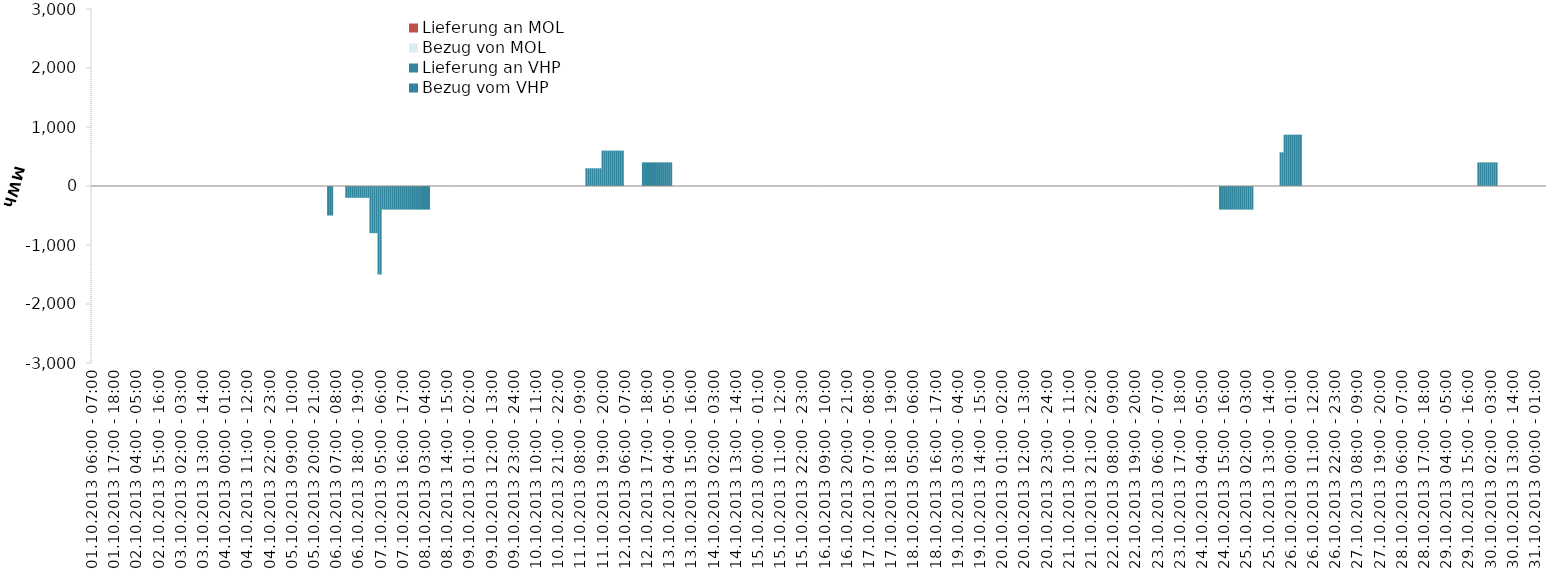
| Category | Bezug vom VHP | Lieferung an VHP | Bezug von MOL | Lieferung an MOL |
|---|---|---|---|---|
| 01.10.2013 06:00 - 07:00 | 0 | 0 | 0 | 0 |
| 01.10.2013 07:00 - 08:00 | 0 | 0 | 0 | 0 |
| 01.10.2013 08:00 - 09:00 | 0 | 0 | 0 | 0 |
| 01.10.2013 09:00 - 10:00 | 0 | 0 | 0 | 0 |
| 01.10.2013 10:00 - 11:00 | 0 | 0 | 0 | 0 |
| 01.10.2013 11:00 - 12:00 | 0 | 0 | 0 | 0 |
| 01.10.2013 12:00 - 13:00 | 0 | 0 | 0 | 0 |
| 01.10.2013 13:00 - 14:00 | 0 | 0 | 0 | 0 |
| 01.10.2013 14:00 - 15:00 | 0 | 0 | 0 | 0 |
| 01.10.2013 15:00 - 16:00 | 0 | 0 | 0 | 0 |
| 01.10.2013 16:00 - 17:00 | 0 | 0 | 0 | 0 |
| 01.10.2013 17:00 - 18:00 | 0 | 0 | 0 | 0 |
| 01.10.2013 18:00 - 19:00 | 0 | 0 | 0 | 0 |
| 01.10.2013 19:00 - 20:00 | 0 | 0 | 0 | 0 |
| 01.10.2013 20:00 - 21:00 | 0 | 0 | 0 | 0 |
| 01.10.2013 21:00 - 22:00 | 0 | 0 | 0 | 0 |
| 01.10.2013 22:00 - 23:00 | 0 | 0 | 0 | 0 |
| 01.10.2013 23:00 - 24:00 | 0 | 0 | 0 | 0 |
| 02.10.2013 00:00 - 01:00 | 0 | 0 | 0 | 0 |
| 02.10.2013 01:00 - 02:00 | 0 | 0 | 0 | 0 |
| 02.10.2013 02:00 - 03:00 | 0 | 0 | 0 | 0 |
| 02.10.2013 03:00 - 04:00 | 0 | 0 | 0 | 0 |
| 02.10.2013 04:00 - 05:00 | 0 | 0 | 0 | 0 |
| 02.10.2013 05:00 - 06:00 | 0 | 0 | 0 | 0 |
| 02.10.2013 06:00 - 07:00 | 0 | 0 | 0 | 0 |
| 02.10.2013 07:00 - 08:00 | 0 | 0 | 0 | 0 |
| 02.10.2013 08:00 - 09:00 | 0 | 0 | 0 | 0 |
| 02.10.2013 09:00 - 10:00 | 0 | 0 | 0 | 0 |
| 02.10.2013 10:00 - 11:00 | 0 | 0 | 0 | 0 |
| 02.10.2013 11:00 - 12:00 | 0 | 0 | 0 | 0 |
| 02.10.2013 12:00 - 13:00 | 0 | 0 | 0 | 0 |
| 02.10.2013 13:00 - 14:00 | 0 | 0 | 0 | 0 |
| 02.10.2013 14:00 - 15:00 | 0 | 0 | 0 | 0 |
| 02.10.2013 15:00 - 16:00 | 0 | 0 | 0 | 0 |
| 02.10.2013 16:00 - 17:00 | 0 | 0 | 0 | 0 |
| 02.10.2013 17:00 - 18:00 | 0 | 0 | 0 | 0 |
| 02.10.2013 18:00 - 19:00 | 0 | 0 | 0 | 0 |
| 02.10.2013 19:00 - 20:00 | 0 | 0 | 0 | 0 |
| 02.10.2013 20:00 - 21:00 | 0 | 0 | 0 | 0 |
| 02.10.2013 21:00 - 22:00 | 0 | 0 | 0 | 0 |
| 02.10.2013 22:00 - 23:00 | 0 | 0 | 0 | 0 |
| 02.10.2013 23:00 - 24:00 | 0 | 0 | 0 | 0 |
| 03.10.2013 00:00 - 01:00 | 0 | 0 | 0 | 0 |
| 03.10.2013 01:00 - 02:00 | 0 | 0 | 0 | 0 |
| 03.10.2013 02:00 - 03:00 | 0 | 0 | 0 | 0 |
| 03.10.2013 03:00 - 04:00 | 0 | 0 | 0 | 0 |
| 03.10.2013 04:00 - 05:00 | 0 | 0 | 0 | 0 |
| 03.10.2013 05:00 - 06:00 | 0 | 0 | 0 | 0 |
| 03.10.2013 06:00 - 07:00 | 0 | 0 | 0 | 0 |
| 03.10.2013 07:00 - 08:00 | 0 | 0 | 0 | 0 |
| 03.10.2013 08:00 - 09:00 | 0 | 0 | 0 | 0 |
| 03.10.2013 09:00 - 10:00 | 0 | 0 | 0 | 0 |
| 03.10.2013 10:00 - 11:00 | 0 | 0 | 0 | 0 |
| 03.10.2013 11:00 - 12:00 | 0 | 0 | 0 | 0 |
| 03.10.2013 12:00 - 13:00 | 0 | 0 | 0 | 0 |
| 03.10.2013 13:00 - 14:00 | 0 | 0 | 0 | 0 |
| 03.10.2013 14:00 - 15:00 | 0 | 0 | 0 | 0 |
| 03.10.2013 15:00 - 16:00 | 0 | 0 | 0 | 0 |
| 03.10.2013 16:00 - 17:00 | 0 | 0 | 0 | 0 |
| 03.10.2013 17:00 - 18:00 | 0 | 0 | 0 | 0 |
| 03.10.2013 18:00 - 19:00 | 0 | 0 | 0 | 0 |
| 03.10.2013 19:00 - 20:00 | 0 | 0 | 0 | 0 |
| 03.10.2013 20:00 - 21:00 | 0 | 0 | 0 | 0 |
| 03.10.2013 21:00 - 22:00 | 0 | 0 | 0 | 0 |
| 03.10.2013 22:00 - 23:00 | 0 | 0 | 0 | 0 |
| 03.10.2013 23:00 - 24:00 | 0 | 0 | 0 | 0 |
| 04.10.2013 00:00 - 01:00 | 0 | 0 | 0 | 0 |
| 04.10.2013 01:00 - 02:00 | 0 | 0 | 0 | 0 |
| 04.10.2013 02:00 - 03:00 | 0 | 0 | 0 | 0 |
| 04.10.2013 03:00 - 04:00 | 0 | 0 | 0 | 0 |
| 04.10.2013 04:00 - 05:00 | 0 | 0 | 0 | 0 |
| 04.10.2013 05:00 - 06:00 | 0 | 0 | 0 | 0 |
| 04.10.2013 06:00 - 07:00 | 0 | 0 | 0 | 0 |
| 04.10.2013 07:00 - 08:00 | 0 | 0 | 0 | 0 |
| 04.10.2013 08:00 - 09:00 | 0 | 0 | 0 | 0 |
| 04.10.2013 09:00 - 10:00 | 0 | 0 | 0 | 0 |
| 04.10.2013 10:00 - 11:00 | 0 | 0 | 0 | 0 |
| 04.10.2013 11:00 - 12:00 | 0 | 0 | 0 | 0 |
| 04.10.2013 12:00 - 13:00 | 0 | 0 | 0 | 0 |
| 04.10.2013 13:00 - 14:00 | 0 | 0 | 0 | 0 |
| 04.10.2013 14:00 - 15:00 | 0 | 0 | 0 | 0 |
| 04.10.2013 15:00 - 16:00 | 0 | 0 | 0 | 0 |
| 04.10.2013 16:00 - 17:00 | 0 | 0 | 0 | 0 |
| 04.10.2013 17:00 - 18:00 | 0 | 0 | 0 | 0 |
| 04.10.2013 18:00 - 19:00 | 0 | 0 | 0 | 0 |
| 04.10.2013 19:00 - 20:00 | 0 | 0 | 0 | 0 |
| 04.10.2013 20:00 - 21:00 | 0 | 0 | 0 | 0 |
| 04.10.2013 21:00 - 22:00 | 0 | 0 | 0 | 0 |
| 04.10.2013 22:00 - 23:00 | 0 | 0 | 0 | 0 |
| 04.10.2013 23:00 - 24:00 | 0 | 0 | 0 | 0 |
| 05.10.2013 00:00 - 01:00 | 0 | 0 | 0 | 0 |
| 05.10.2013 01:00 - 02:00 | 0 | 0 | 0 | 0 |
| 05.10.2013 02:00 - 03:00 | 0 | 0 | 0 | 0 |
| 05.10.2013 03:00 - 04:00 | 0 | 0 | 0 | 0 |
| 05.10.2013 04:00 - 05:00 | 0 | 0 | 0 | 0 |
| 05.10.2013 05:00 - 06:00 | 0 | 0 | 0 | 0 |
| 05.10.2013 06:00 - 07:00 | 0 | 0 | 0 | 0 |
| 05.10.2013 07:00 - 08:00 | 0 | 0 | 0 | 0 |
| 05.10.2013 08:00 - 09:00 | 0 | 0 | 0 | 0 |
| 05.10.2013 09:00 - 10:00 | 0 | 0 | 0 | 0 |
| 05.10.2013 10:00 - 11:00 | 0 | 0 | 0 | 0 |
| 05.10.2013 11:00 - 12:00 | 0 | 0 | 0 | 0 |
| 05.10.2013 12:00 - 13:00 | 0 | 0 | 0 | 0 |
| 05.10.2013 13:00 - 14:00 | 0 | 0 | 0 | 0 |
| 05.10.2013 14:00 - 15:00 | 0 | 0 | 0 | 0 |
| 05.10.2013 15:00 - 16:00 | 0 | 0 | 0 | 0 |
| 05.10.2013 16:00 - 17:00 | 0 | 0 | 0 | 0 |
| 05.10.2013 17:00 - 18:00 | 0 | 0 | 0 | 0 |
| 05.10.2013 18:00 - 19:00 | 0 | 0 | 0 | 0 |
| 05.10.2013 19:00 - 20:00 | 0 | 0 | 0 | 0 |
| 05.10.2013 20:00 - 21:00 | 0 | 0 | 0 | 0 |
| 05.10.2013 21:00 - 22:00 | 0 | 0 | 0 | 0 |
| 05.10.2013 22:00 - 23:00 | 0 | 0 | 0 | 0 |
| 05.10.2013 23:00 - 24:00 | 0 | 0 | 0 | 0 |
| 06.10.2013 00:00 - 01:00 | 0 | 0 | 0 | 0 |
| 06.10.2013 01:00 - 02:00 | 0 | 0 | 0 | 0 |
| 06.10.2013 02:00 - 03:00 | 0 | 0 | 0 | 0 |
| 06.10.2013 03:00 - 04:00 | 0 | -500 | 0 | 0 |
| 06.10.2013 04:00 - 05:00 | 0 | -500 | 0 | 0 |
| 06.10.2013 05:00 - 06:00 | 0 | -500 | 0 | 0 |
| 06.10.2013 06:00 - 07:00 | 0 | 0 | 0 | 0 |
| 06.10.2013 07:00 - 08:00 | 0 | 0 | 0 | 0 |
| 06.10.2013 08:00 - 09:00 | 0 | 0 | 0 | 0 |
| 06.10.2013 09:00 - 10:00 | 0 | 0 | 0 | 0 |
| 06.10.2013 10:00 - 11:00 | 0 | 0 | 0 | 0 |
| 06.10.2013 11:00 - 12:00 | 0 | 0 | 0 | 0 |
| 06.10.2013 12:00 - 13:00 | 0 | -200 | 0 | 0 |
| 06.10.2013 13:00 - 14:00 | 0 | -200 | 0 | 0 |
| 06.10.2013 14:00 - 15:00 | 0 | -200 | 0 | 0 |
| 06.10.2013 15:00 - 16:00 | 0 | -200 | 0 | 0 |
| 06.10.2013 16:00 - 17:00 | 0 | -200 | 0 | 0 |
| 06.10.2013 17:00 - 18:00 | 0 | -200 | 0 | 0 |
| 06.10.2013 18:00 - 19:00 | 0 | -200 | 0 | 0 |
| 06.10.2013 19:00 - 20:00 | 0 | -200 | 0 | 0 |
| 06.10.2013 20:00 - 21:00 | 0 | -200 | 0 | 0 |
| 06.10.2013 21:00 - 22:00 | 0 | -200 | 0 | 0 |
| 06.10.2013 22:00 - 23:00 | 0 | -200 | 0 | 0 |
| 06.10.2013 23:00 - 24:00 | 0 | -200 | 0 | 0 |
| 07.10.2013 00:00 - 01:00 | 0 | -800 | 0 | 0 |
| 07.10.2013 01:00 - 02:00 | 0 | -800 | 0 | 0 |
| 07.10.2013 02:00 - 03:00 | 0 | -800 | 0 | 0 |
| 07.10.2013 03:00 - 04:00 | 0 | -800 | 0 | 0 |
| 07.10.2013 04:00 - 05:00 | 0 | -1500 | 0 | 0 |
| 07.10.2013 05:00 - 06:00 | 0 | -1500 | 0 | 0 |
| 07.10.2013 06:00 - 07:00 | 0 | -400 | 0 | 0 |
| 07.10.2013 07:00 - 08:00 | 0 | -400 | 0 | 0 |
| 07.10.2013 08:00 - 09:00 | 0 | -400 | 0 | 0 |
| 07.10.2013 09:00 - 10:00 | 0 | -400 | 0 | 0 |
| 07.10.2013 10:00 - 11:00 | 0 | -400 | 0 | 0 |
| 07.10.2013 11:00 - 12:00 | 0 | -400 | 0 | 0 |
| 07.10.2013 12:00 - 13:00 | 0 | -400 | 0 | 0 |
| 07.10.2013 13:00 - 14:00 | 0 | -400 | 0 | 0 |
| 07.10.2013 14:00 - 15:00 | 0 | -400 | 0 | 0 |
| 07.10.2013 15:00 - 16:00 | 0 | -400 | 0 | 0 |
| 07.10.2013 16:00 - 17:00 | 0 | -400 | 0 | 0 |
| 07.10.2013 17:00 - 18:00 | 0 | -400 | 0 | 0 |
| 07.10.2013 18:00 - 19:00 | 0 | -400 | 0 | 0 |
| 07.10.2013 19:00 - 20:00 | 0 | -400 | 0 | 0 |
| 07.10.2013 20:00 - 21:00 | 0 | -400 | 0 | 0 |
| 07.10.2013 21:00 - 22:00 | 0 | -400 | 0 | 0 |
| 07.10.2013 22:00 - 23:00 | 0 | -400 | 0 | 0 |
| 07.10.2013 23:00 - 24:00 | 0 | -400 | 0 | 0 |
| 08.10.2013 00:00 - 01:00 | 0 | -400 | 0 | 0 |
| 08.10.2013 01:00 - 02:00 | 0 | -400 | 0 | 0 |
| 08.10.2013 02:00 - 03:00 | 0 | -400 | 0 | 0 |
| 08.10.2013 03:00 - 04:00 | 0 | -400 | 0 | 0 |
| 08.10.2013 04:00 - 05:00 | 0 | -400 | 0 | 0 |
| 08.10.2013 05:00 - 06:00 | 0 | -400 | 0 | 0 |
| 08.10.2013 06:00 - 07:00 | 0 | 0 | 0 | 0 |
| 08.10.2013 07:00 - 08:00 | 0 | 0 | 0 | 0 |
| 08.10.2013 08:00 - 09:00 | 0 | 0 | 0 | 0 |
| 08.10.2013 09:00 - 10:00 | 0 | 0 | 0 | 0 |
| 08.10.2013 10:00 - 11:00 | 0 | 0 | 0 | 0 |
| 08.10.2013 11:00 - 12:00 | 0 | 0 | 0 | 0 |
| 08.10.2013 12:00 - 13:00 | 0 | 0 | 0 | 0 |
| 08.10.2013 13:00 - 14:00 | 0 | 0 | 0 | 0 |
| 08.10.2013 14:00 - 15:00 | 0 | 0 | 0 | 0 |
| 08.10.2013 15:00 - 16:00 | 0 | 0 | 0 | 0 |
| 08.10.2013 16:00 - 17:00 | 0 | 0 | 0 | 0 |
| 08.10.2013 17:00 - 18:00 | 0 | 0 | 0 | 0 |
| 08.10.2013 18:00 - 19:00 | 0 | 0 | 0 | 0 |
| 08.10.2013 19:00 - 20:00 | 0 | 0 | 0 | 0 |
| 08.10.2013 20:00 - 21:00 | 0 | 0 | 0 | 0 |
| 08.10.2013 21:00 - 22:00 | 0 | 0 | 0 | 0 |
| 08.10.2013 22:00 - 23:00 | 0 | 0 | 0 | 0 |
| 08.10.2013 23:00 - 24:00 | 0 | 0 | 0 | 0 |
| 09.10.2013 00:00 - 01:00 | 0 | 0 | 0 | 0 |
| 09.10.2013 01:00 - 02:00 | 0 | 0 | 0 | 0 |
| 09.10.2013 02:00 - 03:00 | 0 | 0 | 0 | 0 |
| 09.10.2013 03:00 - 04:00 | 0 | 0 | 0 | 0 |
| 09.10.2013 04:00 - 05:00 | 0 | 0 | 0 | 0 |
| 09.10.2013 05:00 - 06:00 | 0 | 0 | 0 | 0 |
| 09.10.2013 06:00 - 07:00 | 0 | 0 | 0 | 0 |
| 09.10.2013 07:00 - 08:00 | 0 | 0 | 0 | 0 |
| 09.10.2013 08:00 - 09:00 | 0 | 0 | 0 | 0 |
| 09.10.2013 09:00 - 10:00 | 0 | 0 | 0 | 0 |
| 09.10.2013 10:00 - 11:00 | 0 | 0 | 0 | 0 |
| 09.10.2013 11:00 - 12:00 | 0 | 0 | 0 | 0 |
| 09.10.2013 12:00 - 13:00 | 0 | 0 | 0 | 0 |
| 09.10.2013 13:00 - 14:00 | 0 | 0 | 0 | 0 |
| 09.10.2013 14:00 - 15:00 | 0 | 0 | 0 | 0 |
| 09.10.2013 15:00 - 16:00 | 0 | 0 | 0 | 0 |
| 09.10.2013 16:00 - 17:00 | 0 | 0 | 0 | 0 |
| 09.10.2013 17:00 - 18:00 | 0 | 0 | 0 | 0 |
| 09.10.2013 18:00 - 19:00 | 0 | 0 | 0 | 0 |
| 09.10.2013 19:00 - 20:00 | 0 | 0 | 0 | 0 |
| 09.10.2013 20:00 - 21:00 | 0 | 0 | 0 | 0 |
| 09.10.2013 21:00 - 22:00 | 0 | 0 | 0 | 0 |
| 09.10.2013 22:00 - 23:00 | 0 | 0 | 0 | 0 |
| 09.10.2013 23:00 - 24:00 | 0 | 0 | 0 | 0 |
| 10.10.2013 00:00 - 01:00 | 0 | 0 | 0 | 0 |
| 10.10.2013 01:00 - 02:00 | 0 | 0 | 0 | 0 |
| 10.10.2013 02:00 - 03:00 | 0 | 0 | 0 | 0 |
| 10.10.2013 03:00 - 04:00 | 0 | 0 | 0 | 0 |
| 10.10.2013 04:00 - 05:00 | 0 | 0 | 0 | 0 |
| 10.10.2013 05:00 - 06:00 | 0 | 0 | 0 | 0 |
| 10.10.2013 06:00 - 07:00 | 0 | 0 | 0 | 0 |
| 10.10.2013 07:00 - 08:00 | 0 | 0 | 0 | 0 |
| 10.10.2013 08:00 - 09:00 | 0 | 0 | 0 | 0 |
| 10.10.2013 09:00 - 10:00 | 0 | 0 | 0 | 0 |
| 10.10.2013 10:00 - 11:00 | 0 | 0 | 0 | 0 |
| 10.10.2013 11:00 - 12:00 | 0 | 0 | 0 | 0 |
| 10.10.2013 12:00 - 13:00 | 0 | 0 | 0 | 0 |
| 10.10.2013 13:00 - 14:00 | 0 | 0 | 0 | 0 |
| 10.10.2013 14:00 - 15:00 | 0 | 0 | 0 | 0 |
| 10.10.2013 15:00 - 16:00 | 0 | 0 | 0 | 0 |
| 10.10.2013 16:00 - 17:00 | 0 | 0 | 0 | 0 |
| 10.10.2013 17:00 - 18:00 | 0 | 0 | 0 | 0 |
| 10.10.2013 18:00 - 19:00 | 0 | 0 | 0 | 0 |
| 10.10.2013 19:00 - 20:00 | 0 | 0 | 0 | 0 |
| 10.10.2013 20:00 - 21:00 | 0 | 0 | 0 | 0 |
| 10.10.2013 21:00 - 22:00 | 0 | 0 | 0 | 0 |
| 10.10.2013 22:00 - 23:00 | 0 | 0 | 0 | 0 |
| 10.10.2013 23:00 - 24:00 | 0 | 0 | 0 | 0 |
| 11.10.2013 00:00 - 01:00 | 0 | 0 | 0 | 0 |
| 11.10.2013 01:00 - 02:00 | 0 | 0 | 0 | 0 |
| 11.10.2013 02:00 - 03:00 | 0 | 0 | 0 | 0 |
| 11.10.2013 03:00 - 04:00 | 0 | 0 | 0 | 0 |
| 11.10.2013 04:00 - 05:00 | 0 | 0 | 0 | 0 |
| 11.10.2013 05:00 - 06:00 | 0 | 0 | 0 | 0 |
| 11.10.2013 06:00 - 07:00 | 0 | 0 | 0 | 0 |
| 11.10.2013 07:00 - 08:00 | 0 | 0 | 0 | 0 |
| 11.10.2013 08:00 - 09:00 | 0 | 0 | 0 | 0 |
| 11.10.2013 09:00 - 10:00 | 0 | 0 | 0 | 0 |
| 11.10.2013 10:00 - 11:00 | 0 | 0 | 0 | 0 |
| 11.10.2013 11:00 - 12:00 | 300 | 0 | 0 | 0 |
| 11.10.2013 12:00 - 13:00 | 300 | 0 | 0 | 0 |
| 11.10.2013 13:00 - 14:00 | 300 | 0 | 0 | 0 |
| 11.10.2013 14:00 - 15:00 | 300 | 0 | 0 | 0 |
| 11.10.2013 15:00 - 16:00 | 300 | 0 | 0 | 0 |
| 11.10.2013 16:00 - 17:00 | 300 | 0 | 0 | 0 |
| 11.10.2013 17:00 - 18:00 | 300 | 0 | 0 | 0 |
| 11.10.2013 18:00 - 19:00 | 300 | 0 | 0 | 0 |
| 11.10.2013 19:00 - 20:00 | 600 | 0 | 0 | 0 |
| 11.10.2013 20:00 - 21:00 | 600 | 0 | 0 | 0 |
| 11.10.2013 21:00 - 22:00 | 600 | 0 | 0 | 0 |
| 11.10.2013 22:00 - 23:00 | 600 | 0 | 0 | 0 |
| 11.10.2013 23:00 - 24:00 | 600 | 0 | 0 | 0 |
| 12.10.2013 00:00 - 01:00 | 600 | 0 | 0 | 0 |
| 12.10.2013 01:00 - 02:00 | 600 | 0 | 0 | 0 |
| 12.10.2013 02:00 - 03:00 | 600 | 0 | 0 | 0 |
| 12.10.2013 03:00 - 04:00 | 600 | 0 | 0 | 0 |
| 12.10.2013 04:00 - 05:00 | 600 | 0 | 0 | 0 |
| 12.10.2013 05:00 - 06:00 | 600 | 0 | 0 | 0 |
| 12.10.2013 06:00 - 07:00 | 0 | 0 | 0 | 0 |
| 12.10.2013 07:00 - 08:00 | 0 | 0 | 0 | 0 |
| 12.10.2013 08:00 - 09:00 | 0 | 0 | 0 | 0 |
| 12.10.2013 09:00 - 10:00 | 0 | 0 | 0 | 0 |
| 12.10.2013 10:00 - 11:00 | 0 | 0 | 0 | 0 |
| 12.10.2013 11:00 - 12:00 | 0 | 0 | 0 | 0 |
| 12.10.2013 12:00 - 13:00 | 0 | 0 | 0 | 0 |
| 12.10.2013 13:00 - 14:00 | 0 | 0 | 0 | 0 |
| 12.10.2013 14:00 - 15:00 | 0 | 0 | 0 | 0 |
| 12.10.2013 15:00 - 16:00 | 400 | 0 | 0 | 0 |
| 12.10.2013 16:00 - 17:00 | 400 | 0 | 0 | 0 |
| 12.10.2013 17:00 - 18:00 | 400 | 0 | 0 | 0 |
| 12.10.2013 18:00 - 19:00 | 400 | 0 | 0 | 0 |
| 12.10.2013 19:00 - 20:00 | 400 | 0 | 0 | 0 |
| 12.10.2013 20:00 - 21:00 | 400 | 0 | 0 | 0 |
| 12.10.2013 21:00 - 22:00 | 400 | 0 | 0 | 0 |
| 12.10.2013 22:00 - 23:00 | 400 | 0 | 0 | 0 |
| 12.10.2013 23:00 - 24:00 | 400 | 0 | 0 | 0 |
| 13.10.2013 00:00 - 01:00 | 400 | 0 | 0 | 0 |
| 13.10.2013 01:00 - 02:00 | 400 | 0 | 0 | 0 |
| 13.10.2013 02:00 - 03:00 | 400 | 0 | 0 | 0 |
| 13.10.2013 03:00 - 04:00 | 400 | 0 | 0 | 0 |
| 13.10.2013 04:00 - 05:00 | 400 | 0 | 0 | 0 |
| 13.10.2013 05:00 - 06:00 | 400 | 0 | 0 | 0 |
| 13.10.2013 06:00 - 07:00 | 0 | 0 | 0 | 0 |
| 13.10.2013 07:00 - 08:00 | 0 | 0 | 0 | 0 |
| 13.10.2013 08:00 - 09:00 | 0 | 0 | 0 | 0 |
| 13.10.2013 09:00 - 10:00 | 0 | 0 | 0 | 0 |
| 13.10.2013 10:00 - 11:00 | 0 | 0 | 0 | 0 |
| 13.10.2013 11:00 - 12:00 | 0 | 0 | 0 | 0 |
| 13.10.2013 12:00 - 13:00 | 0 | 0 | 0 | 0 |
| 13.10.2013 13:00 - 14:00 | 0 | 0 | 0 | 0 |
| 13.10.2013 14:00 - 15:00 | 0 | 0 | 0 | 0 |
| 13.10.2013 15:00 - 16:00 | 0 | 0 | 0 | 0 |
| 13.10.2013 16:00 - 17:00 | 0 | 0 | 0 | 0 |
| 13.10.2013 17:00 - 18:00 | 0 | 0 | 0 | 0 |
| 13.10.2013 18:00 - 19:00 | 0 | 0 | 0 | 0 |
| 13.10.2013 19:00 - 20:00 | 0 | 0 | 0 | 0 |
| 13.10.2013 20:00 - 21:00 | 0 | 0 | 0 | 0 |
| 13.10.2013 21:00 - 22:00 | 0 | 0 | 0 | 0 |
| 13.10.2013 22:00 - 23:00 | 0 | 0 | 0 | 0 |
| 13.10.2013 23:00 - 24:00 | 0 | 0 | 0 | 0 |
| 14.10.2013 00:00 - 01:00 | 0 | 0 | 0 | 0 |
| 14.10.2013 01:00 - 02:00 | 0 | 0 | 0 | 0 |
| 14.10.2013 02:00 - 03:00 | 0 | 0 | 0 | 0 |
| 14.10.2013 03:00 - 04:00 | 0 | 0 | 0 | 0 |
| 14.10.2013 04:00 - 05:00 | 0 | 0 | 0 | 0 |
| 14.10.2013 05:00 - 06:00 | 0 | 0 | 0 | 0 |
| 14.10.2013 06:00 - 07:00 | 0 | 0 | 0 | 0 |
| 14.10.2013 07:00 - 08:00 | 0 | 0 | 0 | 0 |
| 14.10.2013 08:00 - 09:00 | 0 | 0 | 0 | 0 |
| 14.10.2013 09:00 - 10:00 | 0 | 0 | 0 | 0 |
| 14.10.2013 10:00 - 11:00 | 0 | 0 | 0 | 0 |
| 14.10.2013 11:00 - 12:00 | 0 | 0 | 0 | 0 |
| 14.10.2013 12:00 - 13:00 | 0 | 0 | 0 | 0 |
| 14.10.2013 13:00 - 14:00 | 0 | 0 | 0 | 0 |
| 14.10.2013 14:00 - 15:00 | 0 | 0 | 0 | 0 |
| 14.10.2013 15:00 - 16:00 | 0 | 0 | 0 | 0 |
| 14.10.2013 16:00 - 17:00 | 0 | 0 | 0 | 0 |
| 14.10.2013 17:00 - 18:00 | 0 | 0 | 0 | 0 |
| 14.10.2013 18:00 - 19:00 | 0 | 0 | 0 | 0 |
| 14.10.2013 19:00 - 20:00 | 0 | 0 | 0 | 0 |
| 14.10.2013 20:00 - 21:00 | 0 | 0 | 0 | 0 |
| 14.10.2013 21:00 - 22:00 | 0 | 0 | 0 | 0 |
| 14.10.2013 22:00 - 23:00 | 0 | 0 | 0 | 0 |
| 14.10.2013 23:00 - 24:00 | 0 | 0 | 0 | 0 |
| 15.10.2013 00:00 - 01:00 | 0 | 0 | 0 | 0 |
| 15.10.2013 01:00 - 02:00 | 0 | 0 | 0 | 0 |
| 15.10.2013 02:00 - 03:00 | 0 | 0 | 0 | 0 |
| 15.10.2013 03:00 - 04:00 | 0 | 0 | 0 | 0 |
| 15.10.2013 04:00 - 05:00 | 0 | 0 | 0 | 0 |
| 15.10.2013 05:00 - 06:00 | 0 | 0 | 0 | 0 |
| 15.10.2013 06:00 - 07:00 | 0 | 0 | 0 | 0 |
| 15.10.2013 07:00 - 08:00 | 0 | 0 | 0 | 0 |
| 15.10.2013 08:00 - 09:00 | 0 | 0 | 0 | 0 |
| 15.10.2013 09:00 - 10:00 | 0 | 0 | 0 | 0 |
| 15.10.2013 10:00 - 11:00 | 0 | 0 | 0 | 0 |
| 15.10.2013 11:00 - 12:00 | 0 | 0 | 0 | 0 |
| 15.10.2013 12:00 - 13:00 | 0 | 0 | 0 | 0 |
| 15.10.2013 13:00 - 14:00 | 0 | 0 | 0 | 0 |
| 15.10.2013 14:00 - 15:00 | 0 | 0 | 0 | 0 |
| 15.10.2013 15:00 - 16:00 | 0 | 0 | 0 | 0 |
| 15.10.2013 16:00 - 17:00 | 0 | 0 | 0 | 0 |
| 15.10.2013 17:00 - 18:00 | 0 | 0 | 0 | 0 |
| 15.10.2013 18:00 - 19:00 | 0 | 0 | 0 | 0 |
| 15.10.2013 19:00 - 20:00 | 0 | 0 | 0 | 0 |
| 15.10.2013 20:00 - 21:00 | 0 | 0 | 0 | 0 |
| 15.10.2013 21:00 - 22:00 | 0 | 0 | 0 | 0 |
| 15.10.2013 22:00 - 23:00 | 0 | 0 | 0 | 0 |
| 15.10.2013 23:00 - 24:00 | 0 | 0 | 0 | 0 |
| 16.10.2013 00:00 - 01:00 | 0 | 0 | 0 | 0 |
| 16.10.2013 01:00 - 02:00 | 0 | 0 | 0 | 0 |
| 16.10.2013 02:00 - 03:00 | 0 | 0 | 0 | 0 |
| 16.10.2013 03:00 - 04:00 | 0 | 0 | 0 | 0 |
| 16.10.2013 04:00 - 05:00 | 0 | 0 | 0 | 0 |
| 16.10.2013 05:00 - 06:00 | 0 | 0 | 0 | 0 |
| 16.10.2013 06:00 - 07:00 | 0 | 0 | 0 | 0 |
| 16.10.2013 07:00 - 08:00 | 0 | 0 | 0 | 0 |
| 16.10.2013 08:00 - 09:00 | 0 | 0 | 0 | 0 |
| 16.10.2013 09:00 - 10:00 | 0 | 0 | 0 | 0 |
| 16.10.2013 10:00 - 11:00 | 0 | 0 | 0 | 0 |
| 16.10.2013 11:00 - 12:00 | 0 | 0 | 0 | 0 |
| 16.10.2013 12:00 - 13:00 | 0 | 0 | 0 | 0 |
| 16.10.2013 13:00 - 14:00 | 0 | 0 | 0 | 0 |
| 16.10.2013 14:00 - 15:00 | 0 | 0 | 0 | 0 |
| 16.10.2013 15:00 - 16:00 | 0 | 0 | 0 | 0 |
| 16.10.2013 16:00 - 17:00 | 0 | 0 | 0 | 0 |
| 16.10.2013 17:00 - 18:00 | 0 | 0 | 0 | 0 |
| 16.10.2013 18:00 - 19:00 | 0 | 0 | 0 | 0 |
| 16.10.2013 19:00 - 20:00 | 0 | 0 | 0 | 0 |
| 16.10.2013 20:00 - 21:00 | 0 | 0 | 0 | 0 |
| 16.10.2013 21:00 - 22:00 | 0 | 0 | 0 | 0 |
| 16.10.2013 22:00 - 23:00 | 0 | 0 | 0 | 0 |
| 16.10.2013 23:00 - 24:00 | 0 | 0 | 0 | 0 |
| 17.10.2013 00:00 - 01:00 | 0 | 0 | 0 | 0 |
| 17.10.2013 01:00 - 02:00 | 0 | 0 | 0 | 0 |
| 17.10.2013 02:00 - 03:00 | 0 | 0 | 0 | 0 |
| 17.10.2013 03:00 - 04:00 | 0 | 0 | 0 | 0 |
| 17.10.2013 04:00 - 05:00 | 0 | 0 | 0 | 0 |
| 17.10.2013 05:00 - 06:00 | 0 | 0 | 0 | 0 |
| 17.10.2013 06:00 - 07:00 | 0 | 0 | 0 | 0 |
| 17.10.2013 07:00 - 08:00 | 0 | 0 | 0 | 0 |
| 17.10.2013 08:00 - 09:00 | 0 | 0 | 0 | 0 |
| 17.10.2013 09:00 - 10:00 | 0 | 0 | 0 | 0 |
| 17.10.2013 10:00 - 11:00 | 0 | 0 | 0 | 0 |
| 17.10.2013 11:00 - 12:00 | 0 | 0 | 0 | 0 |
| 17.10.2013 12:00 - 13:00 | 0 | 0 | 0 | 0 |
| 17.10.2013 13:00 - 14:00 | 0 | 0 | 0 | 0 |
| 17.10.2013 14:00 - 15:00 | 0 | 0 | 0 | 0 |
| 17.10.2013 15:00 - 16:00 | 0 | 0 | 0 | 0 |
| 17.10.2013 16:00 - 17:00 | 0 | 0 | 0 | 0 |
| 17.10.2013 17:00 - 18:00 | 0 | 0 | 0 | 0 |
| 17.10.2013 18:00 - 19:00 | 0 | 0 | 0 | 0 |
| 17.10.2013 19:00 - 20:00 | 0 | 0 | 0 | 0 |
| 17.10.2013 20:00 - 21:00 | 0 | 0 | 0 | 0 |
| 17.10.2013 21:00 - 22:00 | 0 | 0 | 0 | 0 |
| 17.10.2013 22:00 - 23:00 | 0 | 0 | 0 | 0 |
| 17.10.2013 23:00 - 24:00 | 0 | 0 | 0 | 0 |
| 18.10.2013 00:00 - 01:00 | 0 | 0 | 0 | 0 |
| 18.10.2013 01:00 - 02:00 | 0 | 0 | 0 | 0 |
| 18.10.2013 02:00 - 03:00 | 0 | 0 | 0 | 0 |
| 18.10.2013 03:00 - 04:00 | 0 | 0 | 0 | 0 |
| 18.10.2013 04:00 - 05:00 | 0 | 0 | 0 | 0 |
| 18.10.2013 05:00 - 06:00 | 0 | 0 | 0 | 0 |
| 18.10.2013 06:00 - 07:00 | 0 | 0 | 0 | 0 |
| 18.10.2013 07:00 - 08:00 | 0 | 0 | 0 | 0 |
| 18.10.2013 08:00 - 09:00 | 0 | 0 | 0 | 0 |
| 18.10.2013 09:00 - 10:00 | 0 | 0 | 0 | 0 |
| 18.10.2013 10:00 - 11:00 | 0 | 0 | 0 | 0 |
| 18.10.2013 11:00 - 12:00 | 0 | 0 | 0 | 0 |
| 18.10.2013 12:00 - 13:00 | 0 | 0 | 0 | 0 |
| 18.10.2013 13:00 - 14:00 | 0 | 0 | 0 | 0 |
| 18.10.2013 14:00 - 15:00 | 0 | 0 | 0 | 0 |
| 18.10.2013 15:00 - 16:00 | 0 | 0 | 0 | 0 |
| 18.10.2013 16:00 - 17:00 | 0 | 0 | 0 | 0 |
| 18.10.2013 17:00 - 18:00 | 0 | 0 | 0 | 0 |
| 18.10.2013 18:00 - 19:00 | 0 | 0 | 0 | 0 |
| 18.10.2013 19:00 - 20:00 | 0 | 0 | 0 | 0 |
| 18.10.2013 20:00 - 21:00 | 0 | 0 | 0 | 0 |
| 18.10.2013 21:00 - 22:00 | 0 | 0 | 0 | 0 |
| 18.10.2013 22:00 - 23:00 | 0 | 0 | 0 | 0 |
| 18.10.2013 23:00 - 24:00 | 0 | 0 | 0 | 0 |
| 19.10.2013 00:00 - 01:00 | 0 | 0 | 0 | 0 |
| 19.10.2013 01:00 - 02:00 | 0 | 0 | 0 | 0 |
| 19.10.2013 02:00 - 03:00 | 0 | 0 | 0 | 0 |
| 19.10.2013 03:00 - 04:00 | 0 | 0 | 0 | 0 |
| 19.10.2013 04:00 - 05:00 | 0 | 0 | 0 | 0 |
| 19.10.2013 05:00 - 06:00 | 0 | 0 | 0 | 0 |
| 19.10.2013 06:00 - 07:00 | 0 | 0 | 0 | 0 |
| 19.10.2013 07:00 - 08:00 | 0 | 0 | 0 | 0 |
| 19.10.2013 08:00 - 09:00 | 0 | 0 | 0 | 0 |
| 19.10.2013 09:00 - 10:00 | 0 | 0 | 0 | 0 |
| 19.10.2013 10:00 - 11:00 | 0 | 0 | 0 | 0 |
| 19.10.2013 11:00 - 12:00 | 0 | 0 | 0 | 0 |
| 19.10.2013 12:00 - 13:00 | 0 | 0 | 0 | 0 |
| 19.10.2013 13:00 - 14:00 | 0 | 0 | 0 | 0 |
| 19.10.2013 14:00 - 15:00 | 0 | 0 | 0 | 0 |
| 19.10.2013 15:00 - 16:00 | 0 | 0 | 0 | 0 |
| 19.10.2013 16:00 - 17:00 | 0 | 0 | 0 | 0 |
| 19.10.2013 17:00 - 18:00 | 0 | 0 | 0 | 0 |
| 19.10.2013 18:00 - 19:00 | 0 | 0 | 0 | 0 |
| 19.10.2013 19:00 - 20:00 | 0 | 0 | 0 | 0 |
| 19.10.2013 20:00 - 21:00 | 0 | 0 | 0 | 0 |
| 19.10.2013 21:00 - 22:00 | 0 | 0 | 0 | 0 |
| 19.10.2013 22:00 - 23:00 | 0 | 0 | 0 | 0 |
| 19.10.2013 23:00 - 24:00 | 0 | 0 | 0 | 0 |
| 20.10.2013 00:00 - 01:00 | 0 | 0 | 0 | 0 |
| 20.10.2013 01:00 - 02:00 | 0 | 0 | 0 | 0 |
| 20.10.2013 02:00 - 03:00 | 0 | 0 | 0 | 0 |
| 20.10.2013 03:00 - 04:00 | 0 | 0 | 0 | 0 |
| 20.10.2013 04:00 - 05:00 | 0 | 0 | 0 | 0 |
| 20.10.2013 05:00 - 06:00 | 0 | 0 | 0 | 0 |
| 20.10.2013 06:00 - 07:00 | 0 | 0 | 0 | 0 |
| 20.10.2013 07:00 - 08:00 | 0 | 0 | 0 | 0 |
| 20.10.2013 08:00 - 09:00 | 0 | 0 | 0 | 0 |
| 20.10.2013 09:00 - 10:00 | 0 | 0 | 0 | 0 |
| 20.10.2013 10:00 - 11:00 | 0 | 0 | 0 | 0 |
| 20.10.2013 11:00 - 12:00 | 0 | 0 | 0 | 0 |
| 20.10.2013 12:00 - 13:00 | 0 | 0 | 0 | 0 |
| 20.10.2013 13:00 - 14:00 | 0 | 0 | 0 | 0 |
| 20.10.2013 14:00 - 15:00 | 0 | 0 | 0 | 0 |
| 20.10.2013 15:00 - 16:00 | 0 | 0 | 0 | 0 |
| 20.10.2013 16:00 - 17:00 | 0 | 0 | 0 | 0 |
| 20.10.2013 17:00 - 18:00 | 0 | 0 | 0 | 0 |
| 20.10.2013 18:00 - 19:00 | 0 | 0 | 0 | 0 |
| 20.10.2013 19:00 - 20:00 | 0 | 0 | 0 | 0 |
| 20.10.2013 20:00 - 21:00 | 0 | 0 | 0 | 0 |
| 20.10.2013 21:00 - 22:00 | 0 | 0 | 0 | 0 |
| 20.10.2013 22:00 - 23:00 | 0 | 0 | 0 | 0 |
| 20.10.2013 23:00 - 24:00 | 0 | 0 | 0 | 0 |
| 21.10.2013 00:00 - 01:00 | 0 | 0 | 0 | 0 |
| 21.10.2013 01:00 - 02:00 | 0 | 0 | 0 | 0 |
| 21.10.2013 02:00 - 03:00 | 0 | 0 | 0 | 0 |
| 21.10.2013 03:00 - 04:00 | 0 | 0 | 0 | 0 |
| 21.10.2013 04:00 - 05:00 | 0 | 0 | 0 | 0 |
| 21.10.2013 05:00 - 06:00 | 0 | 0 | 0 | 0 |
| 21.10.2013 06:00 - 07:00 | 0 | 0 | 0 | 0 |
| 21.10.2013 07:00 - 08:00 | 0 | 0 | 0 | 0 |
| 21.10.2013 08:00 - 09:00 | 0 | 0 | 0 | 0 |
| 21.10.2013 09:00 - 10:00 | 0 | 0 | 0 | 0 |
| 21.10.2013 10:00 - 11:00 | 0 | 0 | 0 | 0 |
| 21.10.2013 11:00 - 12:00 | 0 | 0 | 0 | 0 |
| 21.10.2013 12:00 - 13:00 | 0 | 0 | 0 | 0 |
| 21.10.2013 13:00 - 14:00 | 0 | 0 | 0 | 0 |
| 21.10.2013 14:00 - 15:00 | 0 | 0 | 0 | 0 |
| 21.10.2013 15:00 - 16:00 | 0 | 0 | 0 | 0 |
| 21.10.2013 16:00 - 17:00 | 0 | 0 | 0 | 0 |
| 21.10.2013 17:00 - 18:00 | 0 | 0 | 0 | 0 |
| 21.10.2013 18:00 - 19:00 | 0 | 0 | 0 | 0 |
| 21.10.2013 19:00 - 20:00 | 0 | 0 | 0 | 0 |
| 21.10.2013 20:00 - 21:00 | 0 | 0 | 0 | 0 |
| 21.10.2013 21:00 - 22:00 | 0 | 0 | 0 | 0 |
| 21.10.2013 22:00 - 23:00 | 0 | 0 | 0 | 0 |
| 21.10.2013 23:00 - 24:00 | 0 | 0 | 0 | 0 |
| 22.10.2013 00:00 - 01:00 | 0 | 0 | 0 | 0 |
| 22.10.2013 01:00 - 02:00 | 0 | 0 | 0 | 0 |
| 22.10.2013 02:00 - 03:00 | 0 | 0 | 0 | 0 |
| 22.10.2013 03:00 - 04:00 | 0 | 0 | 0 | 0 |
| 22.10.2013 04:00 - 05:00 | 0 | 0 | 0 | 0 |
| 22.10.2013 05:00 - 06:00 | 0 | 0 | 0 | 0 |
| 22.10.2013 06:00 - 07:00 | 0 | 0 | 0 | 0 |
| 22.10.2013 07:00 - 08:00 | 0 | 0 | 0 | 0 |
| 22.10.2013 08:00 - 09:00 | 0 | 0 | 0 | 0 |
| 22.10.2013 09:00 - 10:00 | 0 | 0 | 0 | 0 |
| 22.10.2013 10:00 - 11:00 | 0 | 0 | 0 | 0 |
| 22.10.2013 11:00 - 12:00 | 0 | 0 | 0 | 0 |
| 22.10.2013 12:00 - 13:00 | 0 | 0 | 0 | 0 |
| 22.10.2013 13:00 - 14:00 | 0 | 0 | 0 | 0 |
| 22.10.2013 14:00 - 15:00 | 0 | 0 | 0 | 0 |
| 22.10.2013 15:00 - 16:00 | 0 | 0 | 0 | 0 |
| 22.10.2013 16:00 - 17:00 | 0 | 0 | 0 | 0 |
| 22.10.2013 17:00 - 18:00 | 0 | 0 | 0 | 0 |
| 22.10.2013 18:00 - 19:00 | 0 | 0 | 0 | 0 |
| 22.10.2013 19:00 - 20:00 | 0 | 0 | 0 | 0 |
| 22.10.2013 20:00 - 21:00 | 0 | 0 | 0 | 0 |
| 22.10.2013 21:00 - 22:00 | 0 | 0 | 0 | 0 |
| 22.10.2013 22:00 - 23:00 | 0 | 0 | 0 | 0 |
| 22.10.2013 23:00 - 24:00 | 0 | 0 | 0 | 0 |
| 23.10.2013 00:00 - 01:00 | 0 | 0 | 0 | 0 |
| 23.10.2013 01:00 - 02:00 | 0 | 0 | 0 | 0 |
| 23.10.2013 02:00 - 03:00 | 0 | 0 | 0 | 0 |
| 23.10.2013 03:00 - 04:00 | 0 | 0 | 0 | 0 |
| 23.10.2013 04:00 - 05:00 | 0 | 0 | 0 | 0 |
| 23.10.2013 05:00 - 06:00 | 0 | 0 | 0 | 0 |
| 23.10.2013 06:00 - 07:00 | 0 | 0 | 0 | 0 |
| 23.10.2013 07:00 - 08:00 | 0 | 0 | 0 | 0 |
| 23.10.2013 08:00 - 09:00 | 0 | 0 | 0 | 0 |
| 23.10.2013 09:00 - 10:00 | 0 | 0 | 0 | 0 |
| 23.10.2013 10:00 - 11:00 | 0 | 0 | 0 | 0 |
| 23.10.2013 11:00 - 12:00 | 0 | 0 | 0 | 0 |
| 23.10.2013 12:00 - 13:00 | 0 | 0 | 0 | 0 |
| 23.10.2013 13:00 - 14:00 | 0 | 0 | 0 | 0 |
| 23.10.2013 14:00 - 15:00 | 0 | 0 | 0 | 0 |
| 23.10.2013 15:00 - 16:00 | 0 | 0 | 0 | 0 |
| 23.10.2013 16:00 - 17:00 | 0 | 0 | 0 | 0 |
| 23.10.2013 17:00 - 18:00 | 0 | 0 | 0 | 0 |
| 23.10.2013 18:00 - 19:00 | 0 | 0 | 0 | 0 |
| 23.10.2013 19:00 - 20:00 | 0 | 0 | 0 | 0 |
| 23.10.2013 20:00 - 21:00 | 0 | 0 | 0 | 0 |
| 23.10.2013 21:00 - 22:00 | 0 | 0 | 0 | 0 |
| 23.10.2013 22:00 - 23:00 | 0 | 0 | 0 | 0 |
| 23.10.2013 23:00 - 24:00 | 0 | 0 | 0 | 0 |
| 24.10.2013 00:00 - 01:00 | 0 | 0 | 0 | 0 |
| 24.10.2013 01:00 - 02:00 | 0 | 0 | 0 | 0 |
| 24.10.2013 02:00 - 03:00 | 0 | 0 | 0 | 0 |
| 24.10.2013 03:00 - 04:00 | 0 | 0 | 0 | 0 |
| 24.10.2013 04:00 - 05:00 | 0 | 0 | 0 | 0 |
| 24.10.2013 05:00 - 06:00 | 0 | 0 | 0 | 0 |
| 24.10.2013 06:00 - 07:00 | 0 | 0 | 0 | 0 |
| 24.10.2013 07:00 - 08:00 | 0 | 0 | 0 | 0 |
| 24.10.2013 08:00 - 09:00 | 0 | 0 | 0 | 0 |
| 24.10.2013 09:00 - 10:00 | 0 | 0 | 0 | 0 |
| 24.10.2013 10:00 - 11:00 | 0 | 0 | 0 | 0 |
| 24.10.2013 11:00 - 12:00 | 0 | 0 | 0 | 0 |
| 24.10.2013 12:00 - 13:00 | 0 | 0 | 0 | 0 |
| 24.10.2013 13:00 - 14:00 | 0 | -400 | 0 | 0 |
| 24.10.2013 14:00 - 15:00 | 0 | -400 | 0 | 0 |
| 24.10.2013 15:00 - 16:00 | 0 | -400 | 0 | 0 |
| 24.10.2013 16:00 - 17:00 | 0 | -400 | 0 | 0 |
| 24.10.2013 17:00 - 18:00 | 0 | -400 | 0 | 0 |
| 24.10.2013 18:00 - 19:00 | 0 | -400 | 0 | 0 |
| 24.10.2013 19:00 - 20:00 | 0 | -400 | 0 | 0 |
| 24.10.2013 20:00 - 21:00 | 0 | -400 | 0 | 0 |
| 24.10.2013 21:00 - 22:00 | 0 | -400 | 0 | 0 |
| 24.10.2013 22:00 - 23:00 | 0 | -400 | 0 | 0 |
| 24.10.2013 23:00 - 24:00 | 0 | -400 | 0 | 0 |
| 25.10.2013 00:00 - 01:00 | 0 | -400 | 0 | 0 |
| 25.10.2013 01:00 - 02:00 | 0 | -400 | 0 | 0 |
| 25.10.2013 02:00 - 03:00 | 0 | -400 | 0 | 0 |
| 25.10.2013 03:00 - 04:00 | 0 | -400 | 0 | 0 |
| 25.10.2013 04:00 - 05:00 | 0 | -400 | 0 | 0 |
| 25.10.2013 05:00 - 06:00 | 0 | -400 | 0 | 0 |
| 25.10.2013 06:00 - 07:00 | 0 | 0 | 0 | 0 |
| 25.10.2013 07:00 - 08:00 | 0 | 0 | 0 | 0 |
| 25.10.2013 08:00 - 09:00 | 0 | 0 | 0 | 0 |
| 25.10.2013 09:00 - 10:00 | 0 | 0 | 0 | 0 |
| 25.10.2013 10:00 - 11:00 | 0 | 0 | 0 | 0 |
| 25.10.2013 11:00 - 12:00 | 0 | 0 | 0 | 0 |
| 25.10.2013 12:00 - 13:00 | 0 | 0 | 0 | 0 |
| 25.10.2013 13:00 - 14:00 | 0 | 0 | 0 | 0 |
| 25.10.2013 14:00 - 15:00 | 0 | 0 | 0 | 0 |
| 25.10.2013 15:00 - 16:00 | 0 | 0 | 0 | 0 |
| 25.10.2013 16:00 - 17:00 | 0 | 0 | 0 | 0 |
| 25.10.2013 17:00 - 18:00 | 0 | 0 | 0 | 0 |
| 25.10.2013 18:00 - 19:00 | 0 | 0 | 0 | 0 |
| 25.10.2013 19:00 - 20:00 | 570 | 0 | 0 | 0 |
| 25.10.2013 20:00 - 21:00 | 570 | 0 | 0 | 0 |
| 25.10.2013 21:00 - 22:00 | 870 | 0 | 0 | 0 |
| 25.10.2013 22:00 - 23:00 | 870 | 0 | 0 | 0 |
| 25.10.2013 23:00 - 24:00 | 870 | 0 | 0 | 0 |
| 26.10.2013 00:00 - 01:00 | 870 | 0 | 0 | 0 |
| 26.10.2013 01:00 - 02:00 | 870 | 0 | 0 | 0 |
| 26.10.2013 02:00 - 03:00 | 870 | 0 | 0 | 0 |
| 26.10.2013 03:00 - 04:00 | 870 | 0 | 0 | 0 |
| 26.10.2013 04:00 - 05:00 | 870 | 0 | 0 | 0 |
| 26.10.2013 05:00 - 06:00 | 870 | 0 | 0 | 0 |
| 26.10.2013 06:00 - 07:00 | 0 | 0 | 0 | 0 |
| 26.10.2013 07:00 - 08:00 | 0 | 0 | 0 | 0 |
| 26.10.2013 08:00 - 09:00 | 0 | 0 | 0 | 0 |
| 26.10.2013 09:00 - 10:00 | 0 | 0 | 0 | 0 |
| 26.10.2013 10:00 - 11:00 | 0 | 0 | 0 | 0 |
| 26.10.2013 11:00 - 12:00 | 0 | 0 | 0 | 0 |
| 26.10.2013 12:00 - 13:00 | 0 | 0 | 0 | 0 |
| 26.10.2013 13:00 - 14:00 | 0 | 0 | 0 | 0 |
| 26.10.2013 14:00 - 15:00 | 0 | 0 | 0 | 0 |
| 26.10.2013 15:00 - 16:00 | 0 | 0 | 0 | 0 |
| 26.10.2013 16:00 - 17:00 | 0 | 0 | 0 | 0 |
| 26.10.2013 17:00 - 18:00 | 0 | 0 | 0 | 0 |
| 26.10.2013 18:00 - 19:00 | 0 | 0 | 0 | 0 |
| 26.10.2013 19:00 - 20:00 | 0 | 0 | 0 | 0 |
| 26.10.2013 20:00 - 21:00 | 0 | 0 | 0 | 0 |
| 26.10.2013 21:00 - 22:00 | 0 | 0 | 0 | 0 |
| 26.10.2013 22:00 - 23:00 | 0 | 0 | 0 | 0 |
| 26.10.2013 23:00 - 24:00 | 0 | 0 | 0 | 0 |
| 27.10.2013 00:00 - 01:00 | 0 | 0 | 0 | 0 |
| 27.10.2013 01:00 - 02:00 | 0 | 0 | 0 | 0 |
| 27.10.2013 02:00 - 03:00 | 0 | 0 | 0 | 0 |
| 27.10.2013 02:00 - 03:00 | 0 | 0 | 0 | 0 |
| 27.10.2013 03:00 - 04:00 | 0 | 0 | 0 | 0 |
| 27.10.2013 04:00 - 05:00 | 0 | 0 | 0 | 0 |
| 27.10.2013 05:00 - 06:00 | 0 | 0 | 0 | 0 |
| 27.10.2013 06:00 - 07:00 | 0 | 0 | 0 | 0 |
| 27.10.2013 07:00 - 08:00 | 0 | 0 | 0 | 0 |
| 27.10.2013 08:00 - 09:00 | 0 | 0 | 0 | 0 |
| 27.10.2013 09:00 - 10:00 | 0 | 0 | 0 | 0 |
| 27.10.2013 10:00 - 11:00 | 0 | 0 | 0 | 0 |
| 27.10.2013 11:00 - 12:00 | 0 | 0 | 0 | 0 |
| 27.10.2013 12:00 - 13:00 | 0 | 0 | 0 | 0 |
| 27.10.2013 13:00 - 14:00 | 0 | 0 | 0 | 0 |
| 27.10.2013 14:00 - 15:00 | 0 | 0 | 0 | 0 |
| 27.10.2013 15:00 - 16:00 | 0 | 0 | 0 | 0 |
| 27.10.2013 16:00 - 17:00 | 0 | 0 | 0 | 0 |
| 27.10.2013 17:00 - 18:00 | 0 | 0 | 0 | 0 |
| 27.10.2013 18:00 - 19:00 | 0 | 0 | 0 | 0 |
| 27.10.2013 19:00 - 20:00 | 0 | 0 | 0 | 0 |
| 27.10.2013 20:00 - 21:00 | 0 | 0 | 0 | 0 |
| 27.10.2013 21:00 - 22:00 | 0 | 0 | 0 | 0 |
| 27.10.2013 22:00 - 23:00 | 0 | 0 | 0 | 0 |
| 27.10.2013 23:00 - 24:00 | 0 | 0 | 0 | 0 |
| 28.10.2013 00:00 - 01:00 | 0 | 0 | 0 | 0 |
| 28.10.2013 01:00 - 02:00 | 0 | 0 | 0 | 0 |
| 28.10.2013 02:00 - 03:00 | 0 | 0 | 0 | 0 |
| 28.10.2013 03:00 - 04:00 | 0 | 0 | 0 | 0 |
| 28.10.2013 04:00 - 05:00 | 0 | 0 | 0 | 0 |
| 28.10.2013 05:00 - 06:00 | 0 | 0 | 0 | 0 |
| 28.10.2013 06:00 - 07:00 | 0 | 0 | 0 | 0 |
| 28.10.2013 07:00 - 08:00 | 0 | 0 | 0 | 0 |
| 28.10.2013 08:00 - 09:00 | 0 | 0 | 0 | 0 |
| 28.10.2013 09:00 - 10:00 | 0 | 0 | 0 | 0 |
| 28.10.2013 10:00 - 11:00 | 0 | 0 | 0 | 0 |
| 28.10.2013 11:00 - 12:00 | 0 | 0 | 0 | 0 |
| 28.10.2013 12:00 - 13:00 | 0 | 0 | 0 | 0 |
| 28.10.2013 13:00 - 14:00 | 0 | 0 | 0 | 0 |
| 28.10.2013 14:00 - 15:00 | 0 | 0 | 0 | 0 |
| 28.10.2013 15:00 - 16:00 | 0 | 0 | 0 | 0 |
| 28.10.2013 16:00 - 17:00 | 0 | 0 | 0 | 0 |
| 28.10.2013 17:00 - 18:00 | 0 | 0 | 0 | 0 |
| 28.10.2013 18:00 - 19:00 | 0 | 0 | 0 | 0 |
| 28.10.2013 19:00 - 20:00 | 0 | 0 | 0 | 0 |
| 28.10.2013 20:00 - 21:00 | 0 | 0 | 0 | 0 |
| 28.10.2013 21:00 - 22:00 | 0 | 0 | 0 | 0 |
| 28.10.2013 22:00 - 23:00 | 0 | 0 | 0 | 0 |
| 28.10.2013 23:00 - 24:00 | 0 | 0 | 0 | 0 |
| 29.10.2013 00:00 - 01:00 | 0 | 0 | 0 | 0 |
| 29.10.2013 01:00 - 02:00 | 0 | 0 | 0 | 0 |
| 29.10.2013 02:00 - 03:00 | 0 | 0 | 0 | 0 |
| 29.10.2013 03:00 - 04:00 | 0 | 0 | 0 | 0 |
| 29.10.2013 04:00 - 05:00 | 0 | 0 | 0 | 0 |
| 29.10.2013 05:00 - 06:00 | 0 | 0 | 0 | 0 |
| 29.10.2013 06:00 - 07:00 | 0 | 0 | 0 | 0 |
| 29.10.2013 07:00 - 08:00 | 0 | 0 | 0 | 0 |
| 29.10.2013 08:00 - 09:00 | 0 | 0 | 0 | 0 |
| 29.10.2013 09:00 - 10:00 | 0 | 0 | 0 | 0 |
| 29.10.2013 10:00 - 11:00 | 0 | 0 | 0 | 0 |
| 29.10.2013 11:00 - 12:00 | 0 | 0 | 0 | 0 |
| 29.10.2013 12:00 - 13:00 | 0 | 0 | 0 | 0 |
| 29.10.2013 13:00 - 14:00 | 0 | 0 | 0 | 0 |
| 29.10.2013 14:00 - 15:00 | 0 | 0 | 0 | 0 |
| 29.10.2013 15:00 - 16:00 | 0 | 0 | 0 | 0 |
| 29.10.2013 16:00 - 17:00 | 0 | 0 | 0 | 0 |
| 29.10.2013 17:00 - 18:00 | 0 | 0 | 0 | 0 |
| 29.10.2013 18:00 - 19:00 | 0 | 0 | 0 | 0 |
| 29.10.2013 19:00 - 20:00 | 0 | 0 | 0 | 0 |
| 29.10.2013 20:00 - 21:00 | 400 | 0 | 0 | 0 |
| 29.10.2013 21:00 - 22:00 | 400 | 0 | 0 | 0 |
| 29.10.2013 22:00 - 23:00 | 400 | 0 | 0 | 0 |
| 29.10.2013 23:00 - 24:00 | 400 | 0 | 0 | 0 |
| 30.10.2013 00:00 - 01:00 | 400 | 0 | 0 | 0 |
| 30.10.2013 01:00 - 02:00 | 400 | 0 | 0 | 0 |
| 30.10.2013 02:00 - 03:00 | 400 | 0 | 0 | 0 |
| 30.10.2013 03:00 - 04:00 | 400 | 0 | 0 | 0 |
| 30.10.2013 04:00 - 05:00 | 400 | 0 | 0 | 0 |
| 30.10.2013 05:00 - 06:00 | 400 | 0 | 0 | 0 |
| 30.10.2013 06:00 - 07:00 | 0 | 0 | 0 | 0 |
| 30.10.2013 07:00 - 08:00 | 0 | 0 | 0 | 0 |
| 30.10.2013 08:00 - 09:00 | 0 | 0 | 0 | 0 |
| 30.10.2013 09:00 - 10:00 | 0 | 0 | 0 | 0 |
| 30.10.2013 10:00 - 11:00 | 0 | 0 | 0 | 0 |
| 30.10.2013 11:00 - 12:00 | 0 | 0 | 0 | 0 |
| 30.10.2013 12:00 - 13:00 | 0 | 0 | 0 | 0 |
| 30.10.2013 13:00 - 14:00 | 0 | 0 | 0 | 0 |
| 30.10.2013 14:00 - 15:00 | 0 | 0 | 0 | 0 |
| 30.10.2013 15:00 - 16:00 | 0 | 0 | 0 | 0 |
| 30.10.2013 16:00 - 17:00 | 0 | 0 | 0 | 0 |
| 30.10.2013 17:00 - 18:00 | 0 | 0 | 0 | 0 |
| 30.10.2013 18:00 - 19:00 | 0 | 0 | 0 | 0 |
| 30.10.2013 19:00 - 20:00 | 0 | 0 | 0 | 0 |
| 30.10.2013 20:00 - 21:00 | 0 | 0 | 0 | 0 |
| 30.10.2013 21:00 - 22:00 | 0 | 0 | 0 | 0 |
| 30.10.2013 22:00 - 23:00 | 0 | 0 | 0 | 0 |
| 30.10.2013 23:00 - 24:00 | 0 | 0 | 0 | 0 |
| 31.10.2013 00:00 - 01:00 | 0 | 0 | 0 | 0 |
| 31.10.2013 01:00 - 02:00 | 0 | 0 | 0 | 0 |
| 31.10.2013 02:00 - 03:00 | 0 | 0 | 0 | 0 |
| 31.10.2013 03:00 - 04:00 | 0 | 0 | 0 | 0 |
| 31.10.2013 04:00 - 05:00 | 0 | 0 | 0 | 0 |
| 31.10.2013 05:00 - 06:00 | 0 | 0 | 0 | 0 |